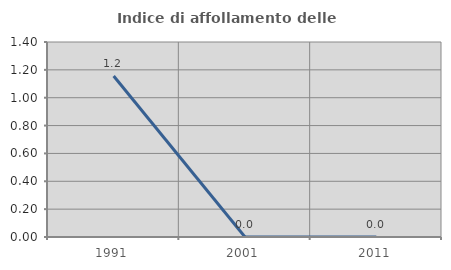
| Category | Indice di affollamento delle abitazioni  |
|---|---|
| 1991.0 | 1.156 |
| 2001.0 | 0 |
| 2011.0 | 0 |